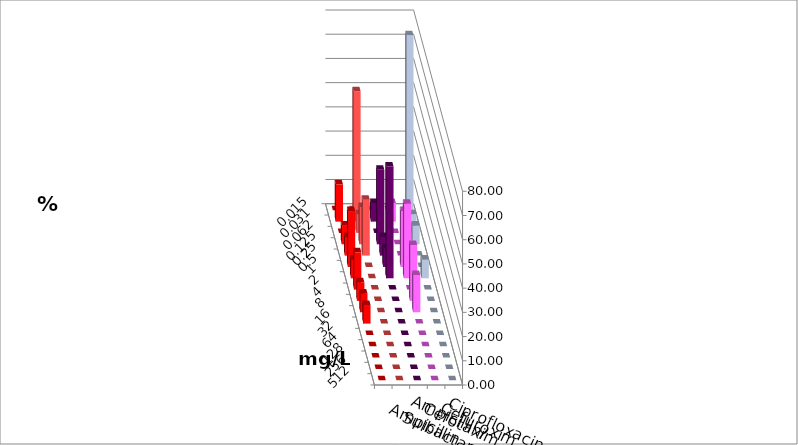
| Category | Ampicillin | Ampicillin/ Sulbactam | Cefotaxim | Cefuroxim | Ciprofloxacin |
|---|---|---|---|---|---|
| 0.015 | 0 | 0 | 0 | 0 | 0 |
| 0.031 | 15.385 | 53.846 | 7.692 | 7.692 | 76.923 |
| 0.062 | 0 | 7.692 | 0 | 0 | 7.692 |
| 0.125 | 7.692 | 15.385 | 30.769 | 0 | 7.692 |
| 0.25 | 7.692 | 23.077 | 7.692 | 0 | 0 |
| 0.5 | 23.077 | 0 | 7.692 | 23.077 | 0 |
| 1.0 | 7.692 | 0 | 46.154 | 30.769 | 7.692 |
| 2.0 | 15.385 | 0 | 0 | 0 | 0 |
| 4.0 | 7.692 | 0 | 0 | 23.077 | 0 |
| 8.0 | 7.692 | 0 | 0 | 15.385 | 0 |
| 16.0 | 7.692 | 0 | 0 | 0 | 0 |
| 32.0 | 0 | 0 | 0 | 0 | 0 |
| 64.0 | 0 | 0 | 0 | 0 | 0 |
| 128.0 | 0 | 0 | 0 | 0 | 0 |
| 256.0 | 0 | 0 | 0 | 0 | 0 |
| 512.0 | 0 | 0 | 0 | 0 | 0 |